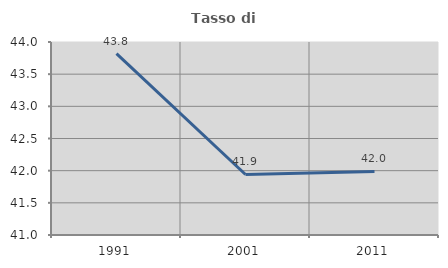
| Category | Tasso di occupazione   |
|---|---|
| 1991.0 | 43.82 |
| 2001.0 | 41.941 |
| 2011.0 | 41.987 |